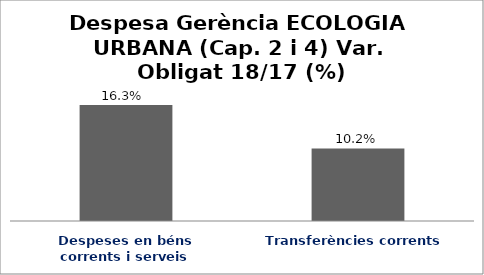
| Category | Series 0 |
|---|---|
| Despeses en béns corrents i serveis | 0.163 |
| Transferències corrents | 0.102 |